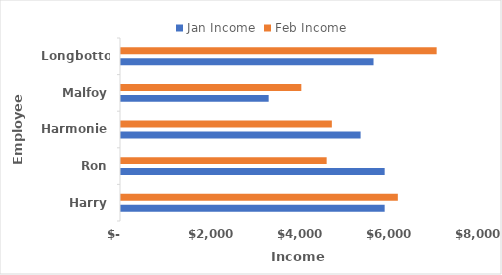
| Category | Jan Income | Feb Income |
|---|---|---|
| Harry | 5924.95 | 6221.2 |
| Ron | 5924.95 | 4621.46 |
| Harmonie | 5384.35 | 4738.23 |
| Malfoy | 3318.35 | 4052.23 |
| Longbottom | 5674.6 | 7093.25 |